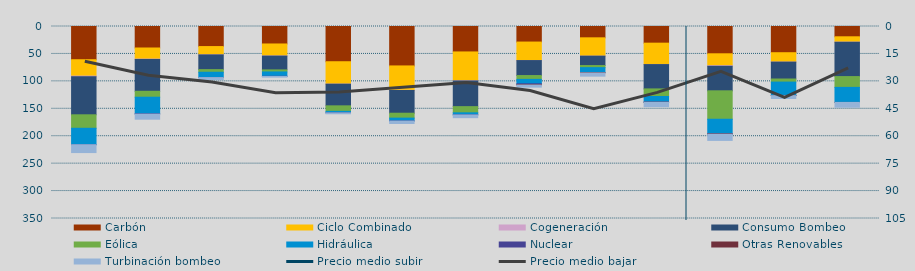
| Category | Carbón | Ciclo Combinado | Cogeneración | Consumo Bombeo | Eólica | Hidráulica | Nuclear | Otras Renovables | Turbinación bombeo |
|---|---|---|---|---|---|---|---|---|---|
| M | 60556.8 | 29853.7 | 1006.6 | 69541.7 | 24572.7 | 29936.2 | 30 | 0 | 14315.8 |
| A | 39185.7 | 20218.6 | 667 | 58045.1 | 10784.5 | 30176.3 | 635.3 | 0 | 9263.7 |
| M | 36573.1 | 14965.8 | 259.5 | 26811.1 | 4780.9 | 9611.3 | 138 | 0 | 3683.8 |
| J | 31856.5 | 21784.2 | 332.6 | 25120.8 | 3742.7 | 7869.8 | 320 | 0 | 1244.9 |
| J | 64224.4 | 40730.5 | 223.6 | 39459.7 | 10048.7 | 2606.4 | 130 | 0 | 1680.4 |
| A | 71875.8 | 44407.8 | 356.8 | 41443.4 | 8916.4 | 5181.1 | 179.2 | 0 | 4517 |
| S | 46377.5 | 52485.1 | 420.2 | 46799.1 | 11262.5 | 3698.4 | 178.3 | 0 | 4969.7 |
| O | 28352.7 | 33701.8 | 72.5 | 27285.6 | 6968.9 | 8057.2 | 1524.1 | 736.2 | 3817.1 |
| N | 20637.7 | 33409.3 | 40.8 | 17072.8 | 3847.5 | 8820.4 | 0 | 757.7 | 5932.4 |
| D | 30371.3 | 38818.7 | 239.5 | 44331.3 | 13873.3 | 10280.7 | 108.3 | 133.8 | 8046.3 |
| E | 49749 | 21689 | 1091.7 | 44705.2 | 51833.3 | 26560.6 | 159.6 | 521.7 | 11348.4 |
| F | 47780.9 | 17066.1 | 83.8 | 30784 | 5603.4 | 24359.1 | 40 | 286.6 | 5220.7 |
| M | 18764.1 | 9673.8 | 444.5 | 62414.7 | 19679.2 | 27422.5 | 0 | 20.9 | 8766.8 |